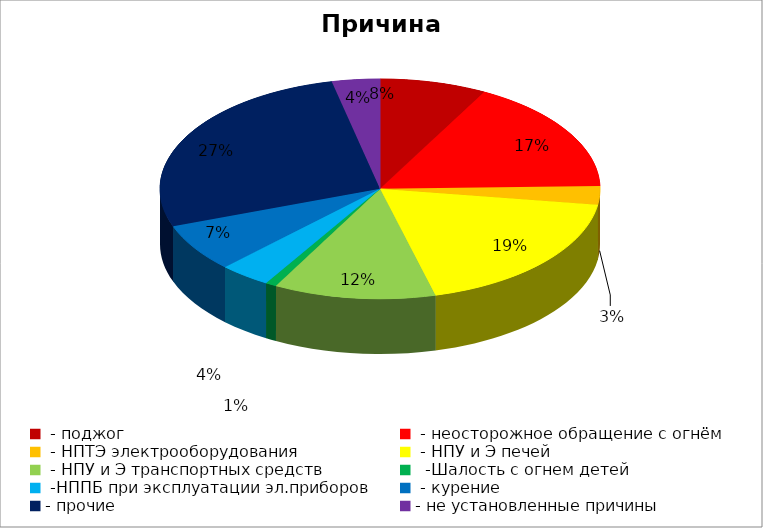
| Category | Причина пожара |
|---|---|
|  - поджог | 29 |
|  - неосторожное обращение с огнём | 62 |
|  - НПТЭ электрооборудования | 10 |
|  - НПУ и Э печей | 69 |
|  - НПУ и Э транспортных средств | 44 |
|   -Шалость с огнем детей | 3 |
|  -НППБ при эксплуатации эл.приборов | 14 |
|  - курение | 26 |
| - прочие | 100 |
| - не установленные причины | 13 |